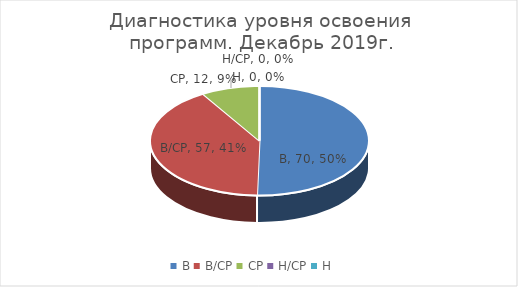
| Category | Series 0 |
|---|---|
| В | 70 |
| В/СР | 57 |
| СР | 12 |
| Н/СР | 0 |
| Н | 0 |